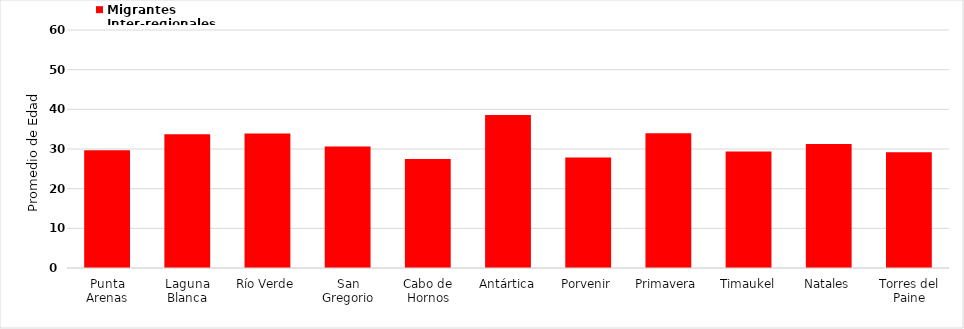
| Category | Migrantes Inter-regionales |
|---|---|
| Punta Arenas | 29.673 |
| Laguna Blanca | 33.696 |
| Río Verde | 33.921 |
| San Gregorio | 30.612 |
| Cabo de Hornos | 27.451 |
| Antártica | 38.557 |
| Porvenir | 27.875 |
| Primavera | 34 |
| Timaukel | 29.338 |
| Natales | 31.243 |
| Torres del Paine | 29.188 |